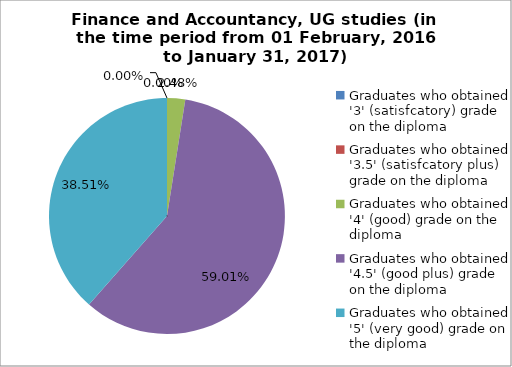
| Category | Series 0 |
|---|---|
| Graduates who obtained '3' (satisfcatory) grade on the diploma | 0 |
| Graduates who obtained '3.5' (satisfcatory plus) grade on the diploma | 0 |
| Graduates who obtained '4' (good) grade on the diploma | 2.484 |
| Graduates who obtained '4.5' (good plus) grade on the diploma | 59.006 |
| Graduates who obtained '5' (very good) grade on the diploma | 38.509 |